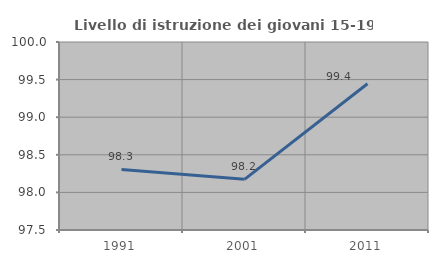
| Category | Livello di istruzione dei giovani 15-19 anni |
|---|---|
| 1991.0 | 98.305 |
| 2001.0 | 98.174 |
| 2011.0 | 99.444 |